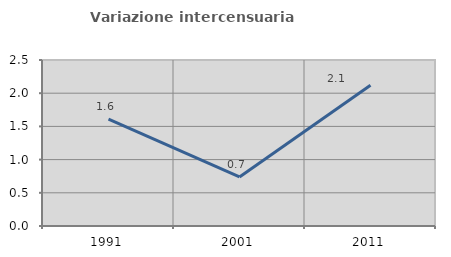
| Category | Variazione intercensuaria annua |
|---|---|
| 1991.0 | 1.611 |
| 2001.0 | 0.739 |
| 2011.0 | 2.12 |